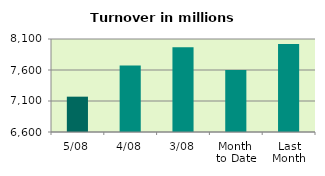
| Category | Series 0 |
|---|---|
| 5/08 | 7169.877 |
| 4/08 | 7673.41 |
| 3/08 | 7966.965 |
| Month 
to Date | 7600.897 |
| Last
Month | 8019.786 |